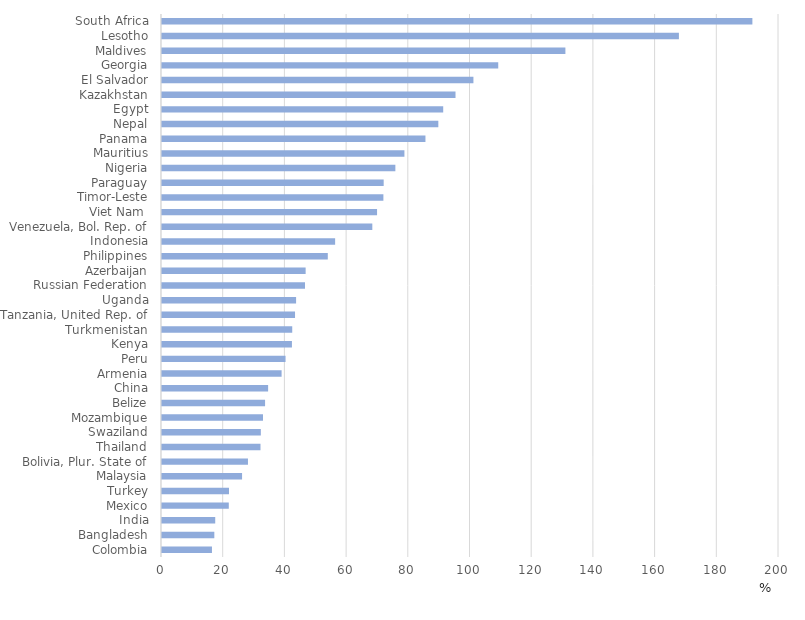
| Category | Series 0 |
|---|---|
| Colombia | 16.193 |
| Bangladesh | 16.96 |
| India | 17.253 |
| Mexico | 21.65 |
| Turkey | 21.714 |
| Malaysia | 25.958 |
| Bolivia, Plur. State of | 27.864 |
| Thailand | 31.925 |
| Swaziland | 32.035 |
| Mozambique | 32.735 |
| Belize | 33.411 |
| China | 34.398 |
| Armenia | 38.766 |
| Peru | 40.046 |
| Kenya | 42.117 |
| Turkmenistan | 42.216 |
| Tanzania, United Rep. of | 43.122 |
| Uganda | 43.465 |
| Russian Federation | 46.353 |
| Azerbaijan | 46.56 |
| Philippines | 53.741 |
| Indonesia | 56.123 |
| Venezuela, Bol. Rep. of | 68.172 |
| Viet Nam  | 69.714 |
| Timor-Leste | 71.765 |
| Paraguay | 71.858 |
| Nigeria | 75.647 |
| Mauritius | 78.58 |
| Panama | 85.397 |
| Nepal | 89.57 |
| Egypt | 91.156 |
| Kazakhstan | 95.139 |
| El Salvador | 100.949 |
| Georgia | 108.992 |
| Maldives | 130.764 |
| Lesotho | 167.554 |
| South Africa | 191.374 |